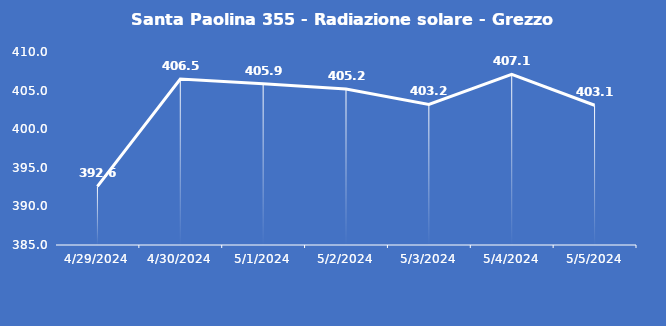
| Category | Santa Paolina 355 - Radiazione solare - Grezzo (W/m2) |
|---|---|
| 4/29/24 | 392.6 |
| 4/30/24 | 406.5 |
| 5/1/24 | 405.9 |
| 5/2/24 | 405.2 |
| 5/3/24 | 403.2 |
| 5/4/24 | 407.1 |
| 5/5/24 | 403.1 |